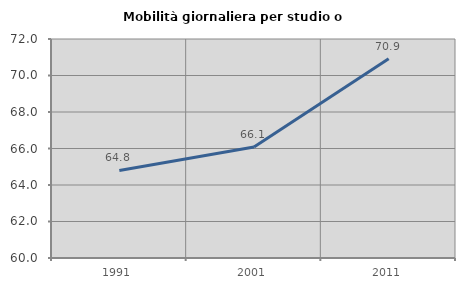
| Category | Mobilità giornaliera per studio o lavoro |
|---|---|
| 1991.0 | 64.799 |
| 2001.0 | 66.088 |
| 2011.0 | 70.919 |